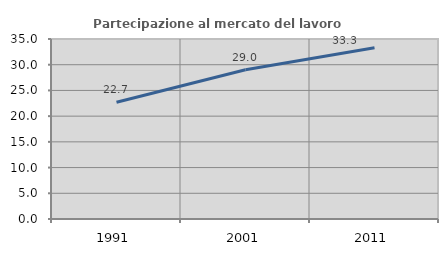
| Category | Partecipazione al mercato del lavoro  femminile |
|---|---|
| 1991.0 | 22.708 |
| 2001.0 | 29.009 |
| 2011.0 | 33.31 |